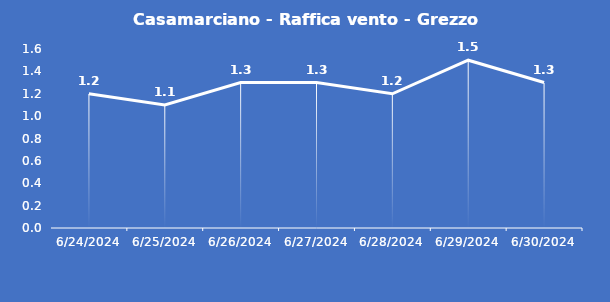
| Category | Casamarciano - Raffica vento - Grezzo (m/s) |
|---|---|
| 6/24/24 | 1.2 |
| 6/25/24 | 1.1 |
| 6/26/24 | 1.3 |
| 6/27/24 | 1.3 |
| 6/28/24 | 1.2 |
| 6/29/24 | 1.5 |
| 6/30/24 | 1.3 |